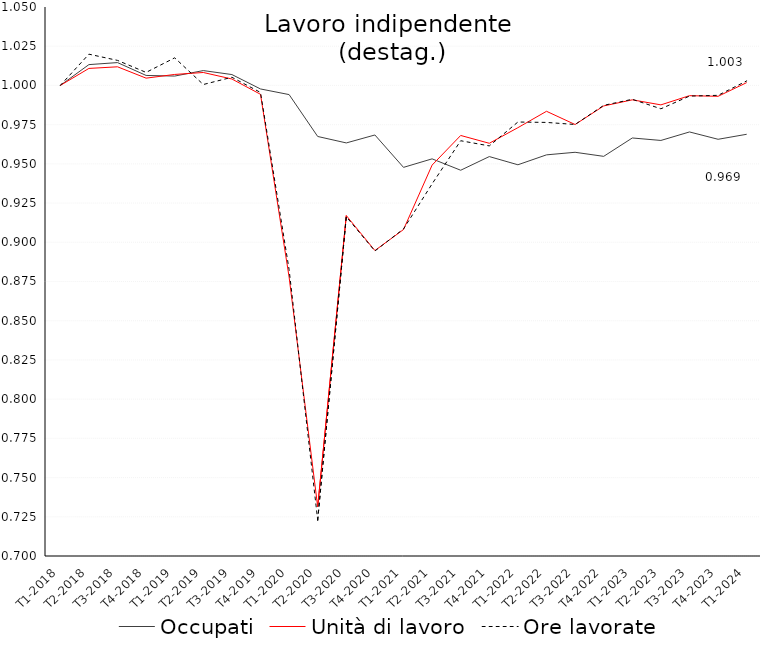
| Category | Occupati | Unità di lavoro | Ore lavorate |
|---|---|---|---|
| T1-2018 | 1 | 1 | 1 |
| T2-2018 | 1.013 | 1.011 | 1.02 |
| T3-2018 | 1.015 | 1.012 | 1.016 |
| T4-2018 | 1.006 | 1.005 | 1.008 |
| T1-2019 | 1.006 | 1.007 | 1.018 |
| T2-2019 | 1.009 | 1.008 | 1.001 |
| T3-2019 | 1.007 | 1.004 | 1.005 |
| T4-2019 | 0.998 | 0.994 | 0.996 |
| T1-2020 | 0.994 | 0.878 | 0.883 |
| T2-2020 | 0.967 | 0.731 | 0.723 |
| T3-2020 | 0.963 | 0.917 | 0.916 |
| T4-2020 | 0.968 | 0.895 | 0.894 |
| T1-2021 | 0.948 | 0.908 | 0.909 |
| T2-2021 | 0.953 | 0.949 | 0.937 |
| T3-2021 | 0.946 | 0.968 | 0.965 |
| T4-2021 | 0.955 | 0.963 | 0.961 |
| T1-2022 | 0.949 | 0.973 | 0.977 |
| T2-2022 | 0.956 | 0.984 | 0.976 |
| T3-2022 | 0.957 | 0.975 | 0.975 |
| T4-2022 | 0.955 | 0.987 | 0.987 |
| T1-2023 | 0.967 | 0.991 | 0.991 |
| T2-2023 | 0.965 | 0.988 | 0.985 |
| T3-2023 | 0.97 | 0.993 | 0.993 |
| T4-2023 | 0.966 | 0.993 | 0.994 |
| T1-2024 | 0.969 | 1.002 | 1.003 |